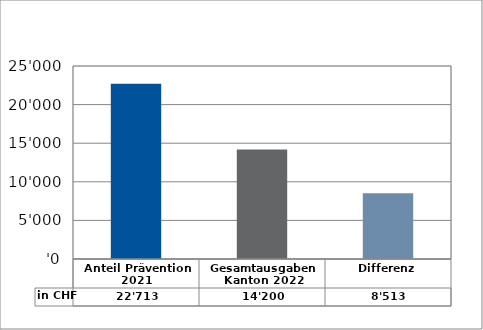
| Category | in CHF |
|---|---|
| Anteil Prävention 2021

 | 22713 |
| Gesamtausgaben Kanton 2022
 | 14200 |
| Differenz | 8513 |